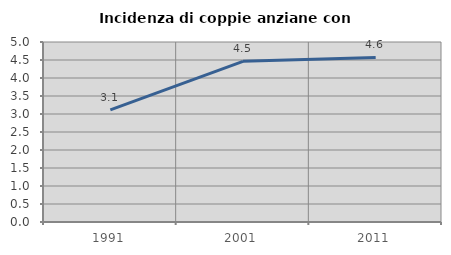
| Category | Incidenza di coppie anziane con figli |
|---|---|
| 1991.0 | 3.117 |
| 2001.0 | 4.462 |
| 2011.0 | 4.571 |